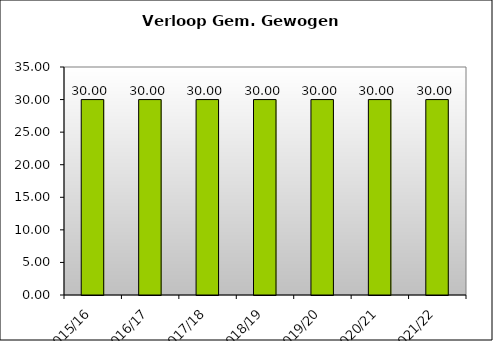
| Category | GGL |
|---|---|
| 2015/16 | 30 |
| 2016/17 | 30 |
| 2017/18 | 30 |
| 2018/19 | 30 |
| 2019/20 | 30 |
| 2020/21 | 30 |
| 2021/22 | 30 |